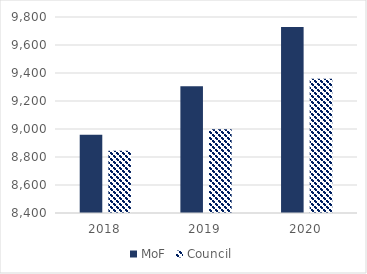
| Category | MoF | Council |
|---|---|---|
| 2018.0 | 8958.114 | 8844.676 |
| 2019.0 | 9305.962 | 8998.332 |
| 2020.0 | 9728.697 | 9359.657 |